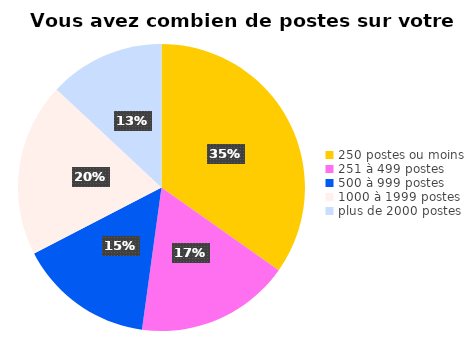
| Category | Series 0 |
|---|---|
| 250 postes ou moins | 16 |
| 251 à 499 postes | 8 |
| 500 à 999 postes | 7 |
| 1000 à 1999 postes | 9 |
| plus de 2000 postes | 6 |